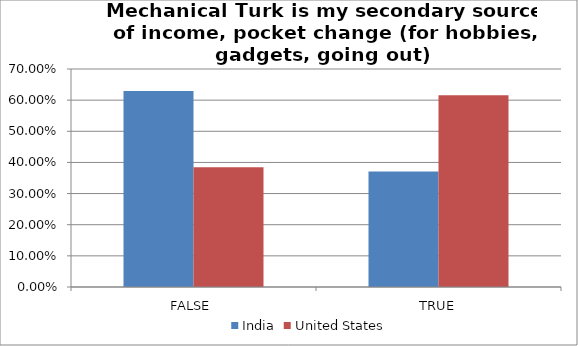
| Category | India | United States |
|---|---|---|
| FALSE | 0.629 | 0.385 |
| TRUE | 0.371 | 0.615 |